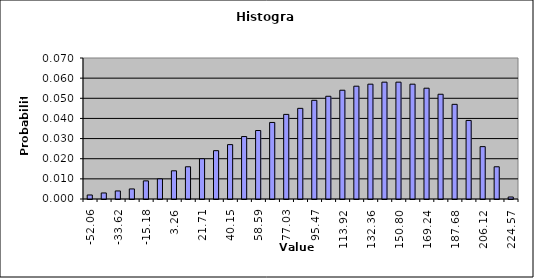
| Category | DISTRIBUTION SCHEDULE |
|---|---|
| -52.062324859100684 | 0.002 |
| -42.841361648347295 | 0.003 |
| -33.620398437593906 | 0.004 |
| -24.399435226840517 | 0.005 |
| -15.17847201608713 | 0.009 |
| -5.957508805333742 | 0.01 |
| 3.2634544054196457 | 0.014 |
| 12.484417616173033 | 0.016 |
| 21.705380826926422 | 0.02 |
| 30.92634403767981 | 0.024 |
| 40.1473072484332 | 0.027 |
| 49.36827045918659 | 0.031 |
| 58.58923366993998 | 0.034 |
| 67.81019688069337 | 0.038 |
| 77.03116009144675 | 0.042 |
| 86.25212330220013 | 0.045 |
| 95.47308651295351 | 0.049 |
| 104.6940497237069 | 0.051 |
| 113.91501293446028 | 0.054 |
| 123.13597614521366 | 0.056 |
| 132.35693935596706 | 0.057 |
| 141.57790256672044 | 0.058 |
| 150.79886577747382 | 0.058 |
| 160.0198289882272 | 0.057 |
| 169.24079219898059 | 0.055 |
| 178.46175540973397 | 0.052 |
| 187.68271862048735 | 0.047 |
| 196.90368183124073 | 0.039 |
| 206.1246450419941 | 0.026 |
| 214.02832779406845 | 0.016 |
| 224.56657146350096 | 0.001 |